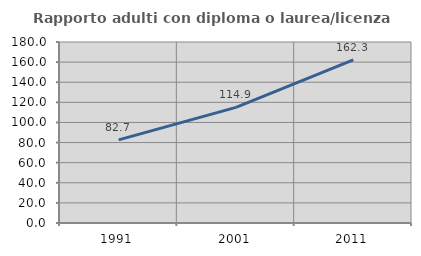
| Category | Rapporto adulti con diploma o laurea/licenza media  |
|---|---|
| 1991.0 | 82.657 |
| 2001.0 | 114.944 |
| 2011.0 | 162.297 |